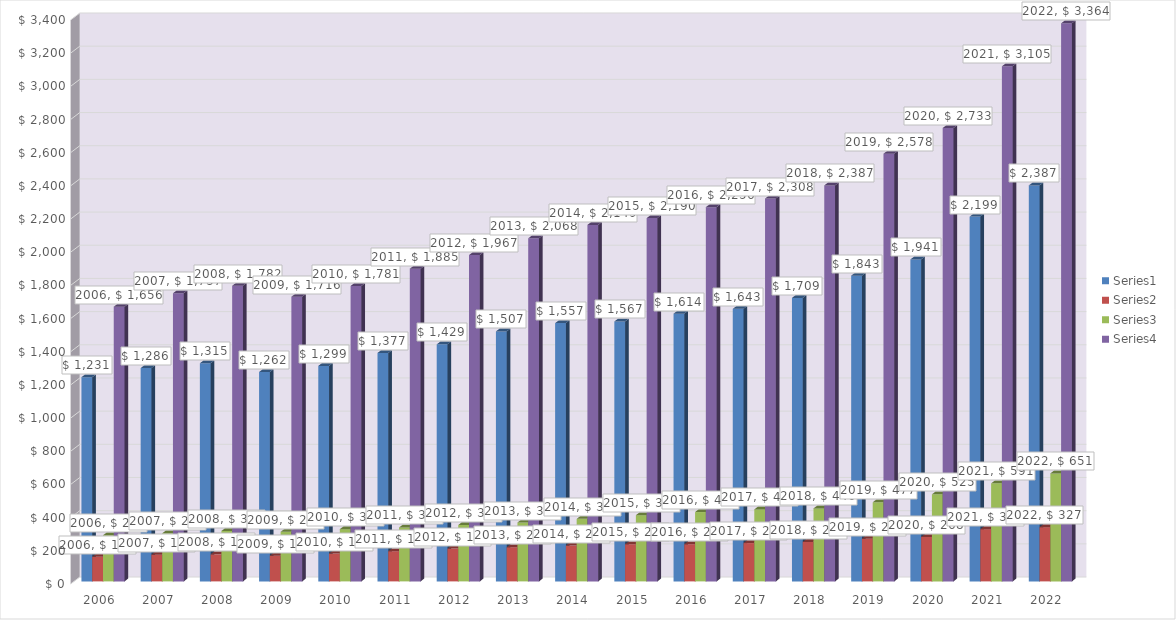
| Category | Series 0 | Series 1 | Series 2 | Series 3 |
|---|---|---|---|---|
| 2006.0 | 1231 | 148 | 278 | 1656 |
| 2007.0 | 1286 | 161 | 290 | 1737 |
| 2008.0 | 1315 | 163 | 304 | 1782 |
| 2009.0 | 1262 | 155 | 299 | 1716 |
| 2010.0 | 1299 | 168 | 315 | 1781 |
| 2011.0 | 1377 | 182 | 325 | 1885 |
| 2012.0 | 1429 | 198 | 340 | 1967 |
| 2013.0 | 1507 | 206 | 355 | 2068 |
| 2014.0 | 1557 | 216 | 377 | 2149 |
| 2015.0 | 1567 | 224 | 399 | 2190 |
| 2016.0 | 1614 | 224 | 418 | 2256 |
| 2017.0 | 1643 | 231 | 434 | 2308 |
| 2018.0 | 1709 | 238 | 440 | 2387 |
| 2019.0 | 1843 | 257 | 477 | 2578 |
| 2020.0 | 1941 | 268 | 525 | 2733 |
| 2021.0 | 2199 | 315 | 591 | 3105 |
| 2022.0 | 2387 | 327 | 651 | 3364 |